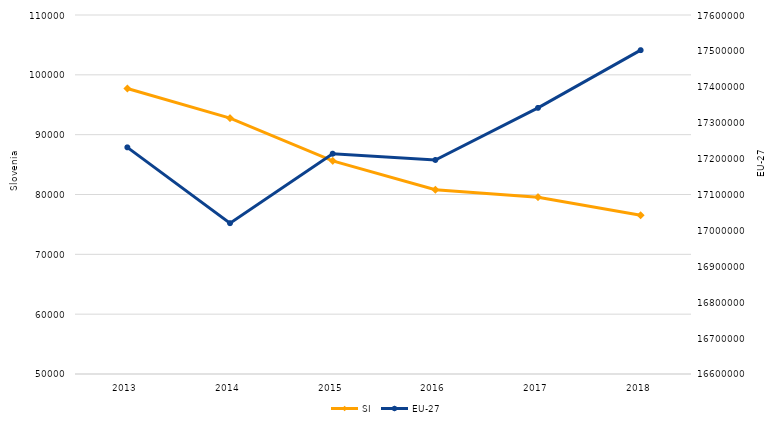
| Category | SI |
|---|---|
| 2013 | 97706 |
| 2014 | 92769 |
| 2015 | 85616 |
| 2016 | 80798 |
| 2017 | 79547 |
| 2018 | 76534 |